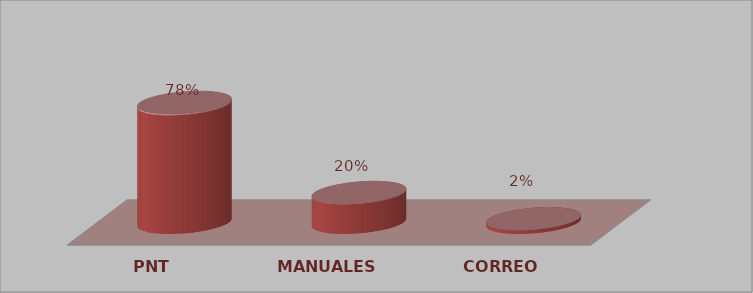
| Category | Series 0 | Series 1 |
|---|---|---|
| PNT | 64 | 0.78 |
| MANUALES | 16 | 0.195 |
| CORREO | 2 | 0.024 |